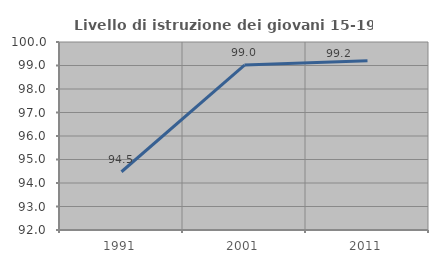
| Category | Livello di istruzione dei giovani 15-19 anni |
|---|---|
| 1991.0 | 94.479 |
| 2001.0 | 99.02 |
| 2011.0 | 99.206 |